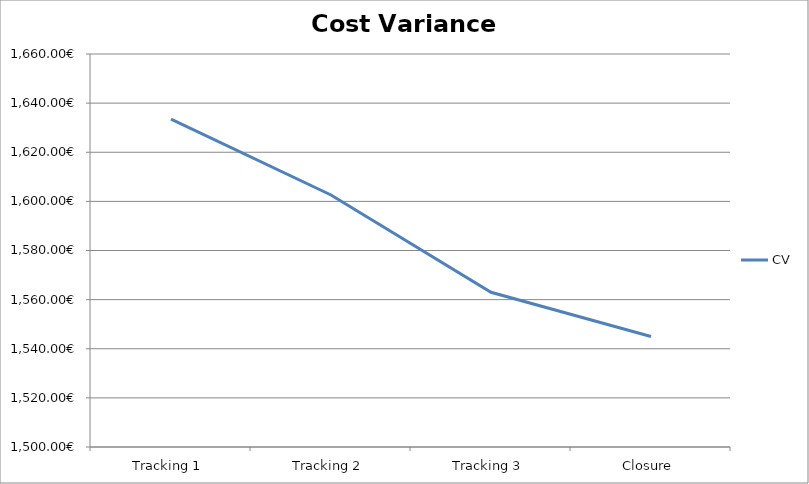
| Category | CV |
|---|---|
| Tracking 1 | 1633.5 |
| Tracking 2 | 1602.6 |
| Tracking 3 | 1563 |
| Closure | 1545 |